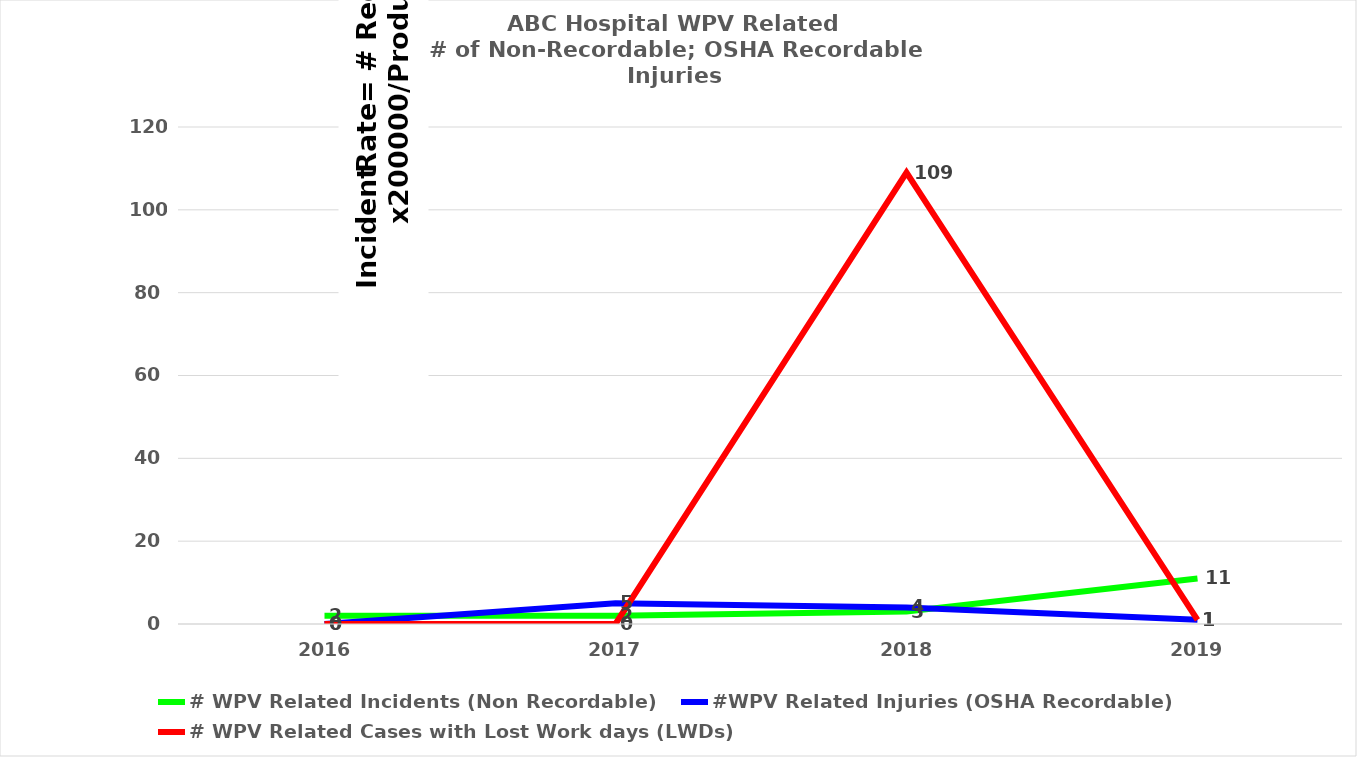
| Category | # WPV Related Incidents (Non Recordable) | #WPV Related Injuries (OSHA Recordable) | # WPV Related Cases with Lost Work days (LWDs)  |
|---|---|---|---|
| 2016.0 | 2 | 0 | 0 |
| 2017.0 | 2 | 5 | 0 |
| 2018.0 | 3 | 4 | 109 |
| 2019.0 | 11 | 1 | 1 |